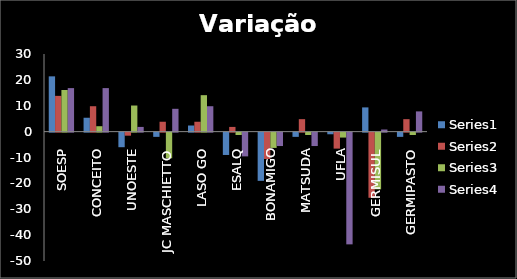
| Category | Series 0 | Series 1 | Series 2 | Series 3 |
|---|---|---|---|---|
| SOESP | 21.364 | 13.818 | 16.091 | 16.818 |
| CONCEITO | 5.364 | 9.818 | 2.091 | 16.818 |
| UNOESTE | -5.636 | -1.182 | 10.091 | 1.818 |
| JC MASCHIETTO | -1.636 | 3.818 | -9.909 | 8.818 |
| LASO GO | 2.364 | 3.818 | 14.091 | 9.818 |
| ESALQ | -8.636 | 1.818 | -0.909 | -9.182 |
| BONAMIGO | -18.636 | -10.182 | -5.909 | -5.182 |
| MATSUDA | -1.636 | 4.818 | -0.909 | -5.182 |
| UFLA | -0.636 | -6.182 | -1.909 | -43.182 |
| GERMISUL | 9.364 | -25.182 | -21.909 | 0.818 |
| GERMIPASTO | -1.636 | 4.818 | -0.909 | 7.818 |